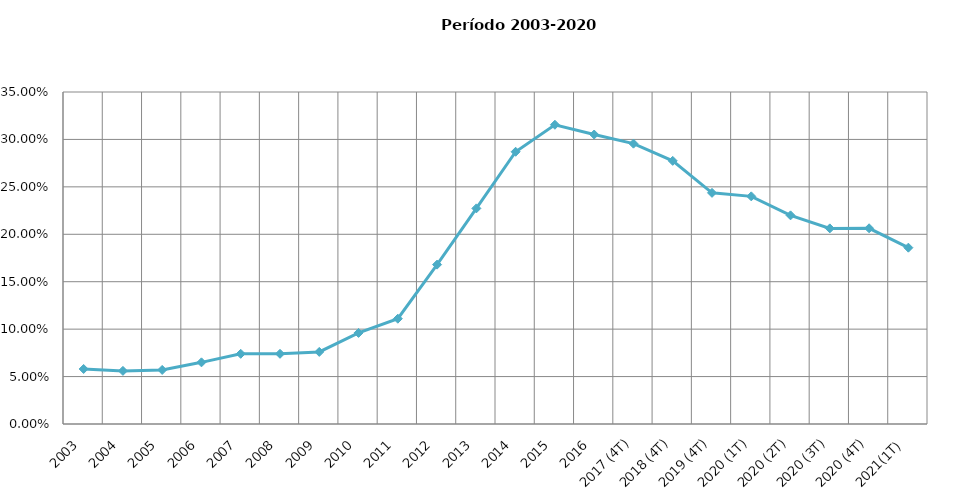
| Category | Grado estimado de penetración del servicio |
|---|---|
| 2003 | 0.058 |
| 2004 | 0.056 |
| 2005 | 0.057 |
| 2006 | 0.065 |
| 2007 | 0.074 |
| 2008 | 0.074 |
| 2009 | 0.076 |
| 2010 | 0.096 |
| 2011 | 0.111 |
| 2012 | 0.168 |
| 2013 | 0.227 |
| 2014 | 0.287 |
| 2015 | 0.315 |
| 2016 | 0.305 |
| 2017 (4T) | 0.296 |
| 2018 (4T) | 0.277 |
| 2019 (4T) | 0.244 |
| 2020 (1T) | 0.24 |
| 2020 (2T) | 0.22 |
| 2020 (3T) | 0.206 |
| 2020 (4T) | 0.206 |
| 2021(1T) | 0.186 |